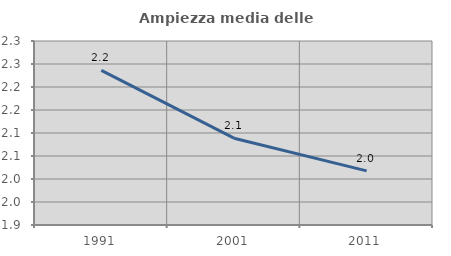
| Category | Ampiezza media delle famiglie |
|---|---|
| 1991.0 | 2.236 |
| 2001.0 | 2.089 |
| 2011.0 | 2.018 |